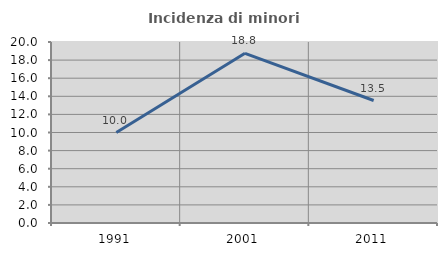
| Category | Incidenza di minori stranieri |
|---|---|
| 1991.0 | 10 |
| 2001.0 | 18.75 |
| 2011.0 | 13.534 |